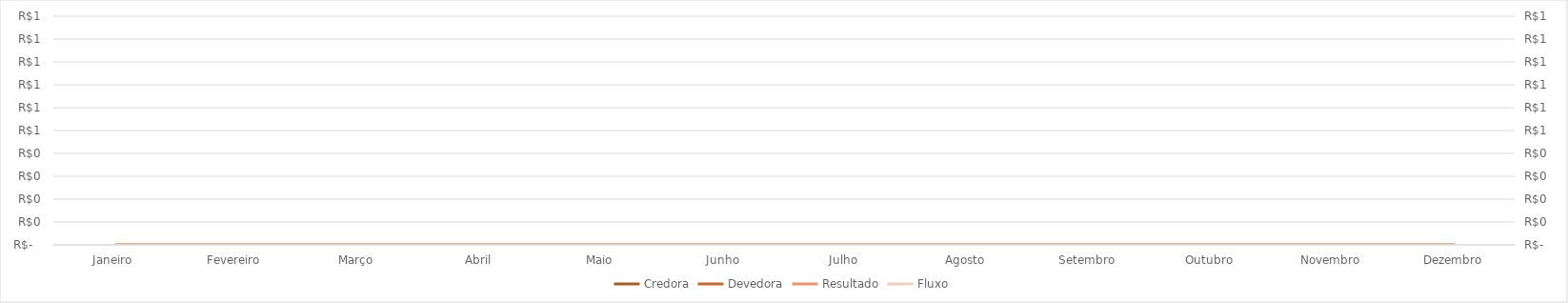
| Category | Credora | Devedora | Resultado |
|---|---|---|---|
| Janeiro | 0 | 0 | 0 |
| Fevereiro | 0 | 0 | 0 |
| Março | 0 | 0 | 0 |
| Abril | 0 | 0 | 0 |
| Maio | 0 | 0 | 0 |
| Junho | 0 | 0 | 0 |
| Julho | 0 | 0 | 0 |
| Agosto | 0 | 0 | 0 |
| Setembro | 0 | 0 | 0 |
| Outubro | 0 | 0 | 0 |
| Novembro | 0 | 0 | 0 |
| Dezembro | 0 | 0 | 0 |